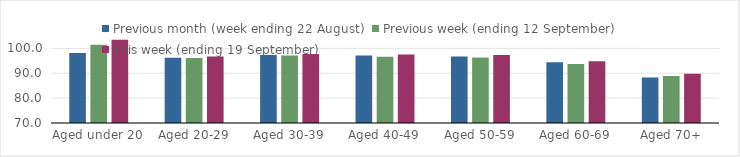
| Category | Previous month (week ending 22 August) | Previous week (ending 12 September) | This week (ending 19 September) |
|---|---|---|---|
| Aged under 20 | 98.19 | 101.5 | 103.53 |
| Aged 20-29 | 96.2 | 96.11 | 96.73 |
| Aged 30-39 | 97.38 | 97.11 | 97.74 |
| Aged 40-49 | 97.15 | 96.62 | 97.51 |
| Aged 50-59 | 96.75 | 96.31 | 97.35 |
| Aged 60-69 | 94.42 | 93.77 | 94.82 |
| Aged 70+ | 88.32 | 88.9 | 89.82 |